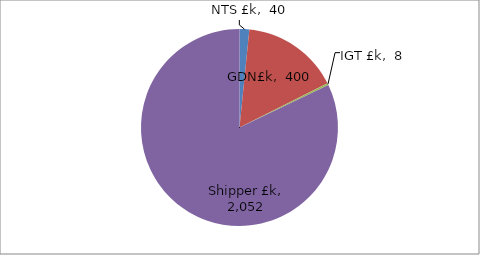
| Category | Series 0 |
|---|---|
| NTS £k | 40 |
| GDN£k | 400 |
| IGT £k | 7.5 |
| Shipper £k | 2052 |